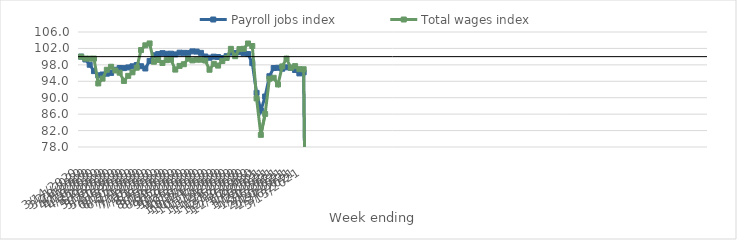
| Category | Payroll jobs index | Total wages index |
|---|---|---|
| 14/03/2020 | 100 | 100 |
| 21/03/2020 | 99.309 | 99.531 |
| 28/03/2020 | 98.028 | 99.517 |
| 04/04/2020 | 96.476 | 99.524 |
| 11/04/2020 | 95.453 | 93.483 |
| 18/04/2020 | 95.652 | 94.646 |
| 25/04/2020 | 95.85 | 96.805 |
| 02/05/2020 | 96.036 | 97.538 |
| 09/05/2020 | 96.816 | 96.627 |
| 16/05/2020 | 97.238 | 96.098 |
| 23/05/2020 | 97.206 | 94.083 |
| 30/05/2020 | 97.375 | 95.321 |
| 06/06/2020 | 97.651 | 96.188 |
| 13/06/2020 | 97.959 | 97.31 |
| 20/06/2020 | 97.668 | 101.6 |
| 27/06/2020 | 97.12 | 102.756 |
| 04/07/2020 | 98.961 | 103.213 |
| 11/07/2020 | 100.334 | 98.763 |
| 18/07/2020 | 100.628 | 99.199 |
| 25/07/2020 | 100.851 | 98.458 |
| 01/08/2020 | 100.694 | 99.142 |
| 08/08/2020 | 100.722 | 99.263 |
| 15/08/2020 | 100.547 | 96.844 |
| 22/08/2020 | 100.96 | 97.747 |
| 29/08/2020 | 100.923 | 98.155 |
| 05/09/2020 | 100.903 | 99.513 |
| 12/09/2020 | 101.284 | 99.091 |
| 19/09/2020 | 101.231 | 99.255 |
| 26/09/2020 | 100.917 | 99.256 |
| 03/10/2020 | 100.038 | 99.059 |
| 10/10/2020 | 99.738 | 96.815 |
| 17/10/2020 | 99.996 | 98.257 |
| 24/10/2020 | 99.902 | 97.818 |
| 31/10/2020 | 99.657 | 98.933 |
| 07/11/2020 | 100.11 | 99.689 |
| 14/11/2020 | 100.974 | 101.897 |
| 21/11/2020 | 100.875 | 100.106 |
| 28/11/2020 | 101.081 | 101.839 |
| 05/12/2020 | 100.814 | 101.912 |
| 12/12/2020 | 100.635 | 103.206 |
| 19/12/2020 | 98.42 | 102.589 |
| 26/12/2020 | 91.187 | 89.823 |
| 02/01/2021 | 86.89 | 80.958 |
| 09/01/2021 | 90.301 | 86.058 |
| 16/01/2021 | 95.233 | 94.623 |
| 23/01/2021 | 97.229 | 94.849 |
| 30/01/2021 | 97.286 | 93.227 |
| 06/02/2021 | 97.058 | 97.622 |
| 13/02/2021 | 97.397 | 99.527 |
| 20/02/2021 | 97.284 | 97.305 |
| 27/02/2021 | 96.739 | 97.692 |
| 06/03/2021 | 95.92 | 96.953 |
| 13/03/2021 | 96.17 | 96.928 |